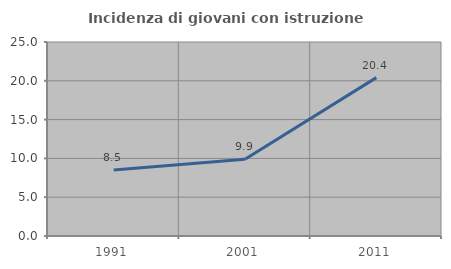
| Category | Incidenza di giovani con istruzione universitaria |
|---|---|
| 1991.0 | 8.511 |
| 2001.0 | 9.89 |
| 2011.0 | 20.408 |